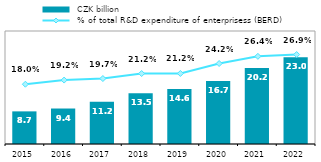
| Category |  CZK billion |
|---|---|
| 2015 | 8.661 |
| 2016 | 9.421 |
| 2017 | 11.19 |
| 2018 | 13.495 |
| 2019 | 14.6 |
| 2020 | 16.739 |
| 2021 | 20.19 |
| 2022 | 23.035 |